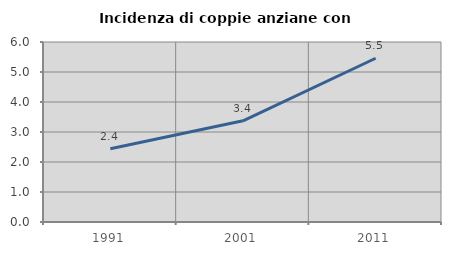
| Category | Incidenza di coppie anziane con figli |
|---|---|
| 1991.0 | 2.439 |
| 2001.0 | 3.373 |
| 2011.0 | 5.458 |